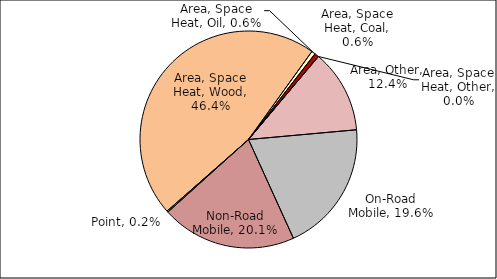
| Category | Series 0 |
|---|---|
| Point | 0.002 |
| Area, Space Heat, Wood | 0.464 |
| Area, Space Heat, Oil | 0.006 |
| Area, Space Heat, Coal | 0.006 |
| Area, Space Heat, Other | 0 |
| Area, Other | 0.124 |
| On-Road Mobile | 0.196 |
| Non-Road Mobile | 0.201 |